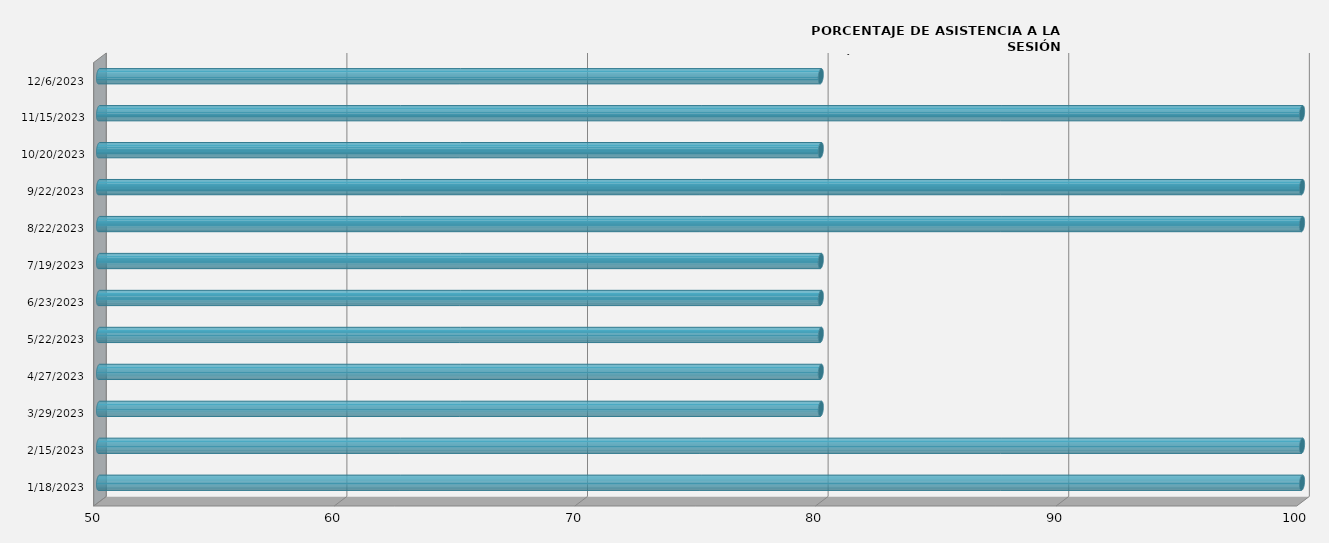
| Category | Series 0 |
|---|---|
| 1/18/23 | 100 |
| 2/15/23 | 100 |
| 3/29/23 | 80 |
| 4/27/23 | 80 |
| 5/22/23 | 80 |
| 6/23/23 | 80 |
| 7/19/23 | 80 |
| 8/22/23 | 100 |
| 9/22/23 | 100 |
| 10/20/23 | 80 |
| 11/15/23 | 100 |
| 12/6/23 | 80 |